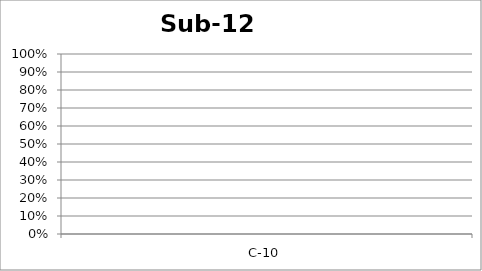
| Category | Sub-12 |
|---|---|
| C-10 | 0 |